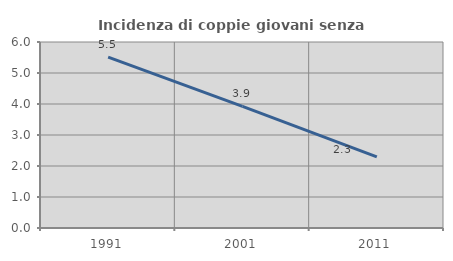
| Category | Incidenza di coppie giovani senza figli |
|---|---|
| 1991.0 | 5.51 |
| 2001.0 | 3.922 |
| 2011.0 | 2.297 |